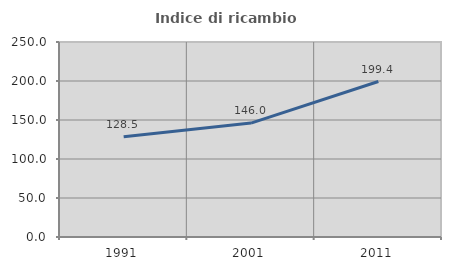
| Category | Indice di ricambio occupazionale  |
|---|---|
| 1991.0 | 128.488 |
| 2001.0 | 146.012 |
| 2011.0 | 199.355 |